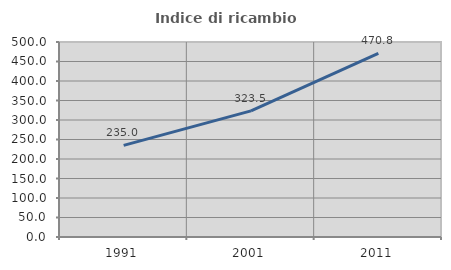
| Category | Indice di ricambio occupazionale  |
|---|---|
| 1991.0 | 235 |
| 2001.0 | 323.529 |
| 2011.0 | 470.833 |